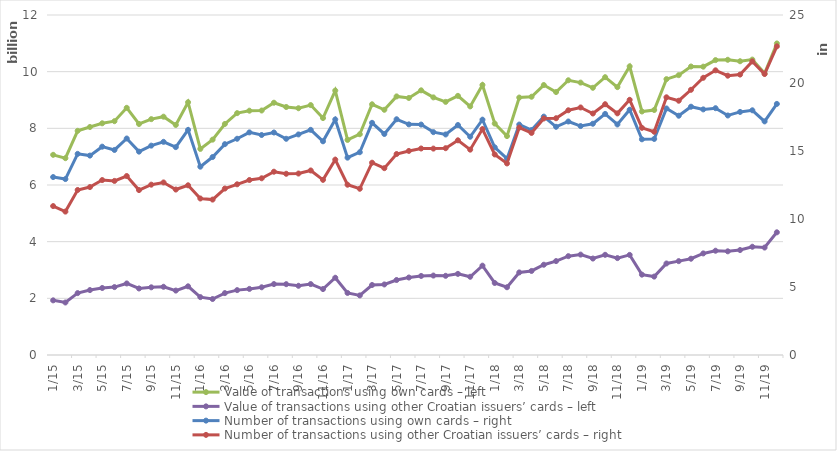
| Category | Value of transactions using own cards – left | Value of transactions using other Croatian issuers’ cards – left |
|---|---|---|
| 2015-01-01 | 7064994843 | 1929030428 |
| 2015-02-01 | 6946593821 | 1853442353 |
| 2015-03-01 | 7912165174 | 2184893592 |
| 2015-04-01 | 8047410707 | 2291375278 |
| 2015-05-01 | 8177632963 | 2365055111 |
| 2015-06-01 | 8252429615 | 2396883379 |
| 2015-07-01 | 8723683467 | 2525158845 |
| 2015-08-01 | 8154008999 | 2348138964 |
| 2015-09-01 | 8324374117 | 2388891653 |
| 2015-10-01 | 8411020213 | 2408144476 |
| 2015-11-01 | 8119141285 | 2274247405 |
| 2015-12-01 | 8921936214 | 2423770136 |
| 2016-01-01 | 7274581698 | 2043165117 |
| 2016-02-01 | 7601069776 | 1975751262 |
| 2016-03-01 | 8154515803 | 2184810922 |
| 2016-04-01 | 8536006184 | 2289803134 |
| 2016-05-01 | 8622612405 | 2332785770 |
| 2016-06-01 | 8629034970 | 2389942571 |
| 2016-07-01 | 8904025504 | 2503371795 |
| 2016-08-01 | 8753008570 | 2499535388 |
| 2016-09-01 | 8709318074 | 2442949613 |
| 2016-10-01 | 8820702928 | 2502592179 |
| 2016-11-01 | 8362820758 | 2327194409 |
| 2016-12-01 | 9332637687 | 2726346925 |
| 2017-01-01 | 7591025836 | 2190190557 |
| 2017-02-01 | 7792091469 | 2102919551 |
| 2017-03-01 | 8848645928 | 2470655643 |
| 2017-04-01 | 8654763470 | 2490413036 |
| 2017-05-01 | 9126642889 | 2647280887 |
| 2017-06-01 | 9071446663 | 2734513423 |
| 2017-07-01 | 9341412109 | 2789614122 |
| 2017-08-01 | 9092498823 | 2803821568 |
| 2017-09-01 | 8934029593 | 2794823429 |
| 2017-10-01 | 9146073082 | 2863098138 |
| 2017-11-01 | 8773453563 | 2761213299 |
| 2017-12-01 | 9531190603 | 3152876747 |
| 2018-01-01 | 8168175334 | 2542574875 |
| 2018-02-01 | 7725941801 | 2391117281 |
| 2018-03-01 | 9086640838 | 2914332631 |
| 2018-04-01 | 9115284060 | 2966306244 |
| 2018-05-01 | 9527954881 | 3185636011 |
| 2018-06-01 | 9280524587 | 3314142126 |
| 2018-07-01 | 9696345600 | 3488598427 |
| 2018-08-01 | 9614295639 | 3543480093 |
| 2018-09-01 | 9431237907 | 3404262357 |
| 2018-10-01 | 9805876605 | 3535796062 |
| 2018-11-01 | 9454012098 | 3420077230 |
| 2018-12-01 | 10187270578 | 3533090860 |
| 2019-01-01 | 8594592220 | 2836141446 |
| 2019-02-01 | 8647096820 | 2767304477 |
| 2019-03-01 | 9736761363 | 3229660568 |
| 2019-04-01 | 9877345789 | 3313084092 |
| 2019-05-01 | 10182036882 | 3398328018 |
| 2019-06-01 | 10176486842 | 3584876239 |
| 2019-07-01 | 10407918601 | 3680350813 |
| 2019-08-01 | 10419305536 | 3659303372 |
| 2019-09-01 | 10368012809 | 3704414714 |
| 2019-10-01 | 10426377072 | 3820842167 |
| 2019-11-01 | 9939836838 | 3792181757 |
| 2019-12-01 | 10995454054 | 4330061303 |